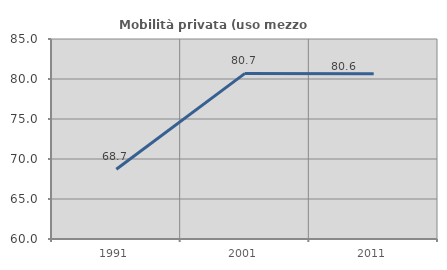
| Category | Mobilità privata (uso mezzo privato) |
|---|---|
| 1991.0 | 68.722 |
| 2001.0 | 80.702 |
| 2011.0 | 80.645 |